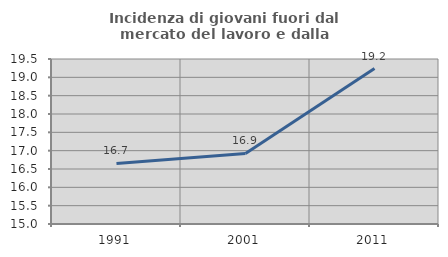
| Category | Incidenza di giovani fuori dal mercato del lavoro e dalla formazione  |
|---|---|
| 1991.0 | 16.653 |
| 2001.0 | 16.923 |
| 2011.0 | 19.24 |